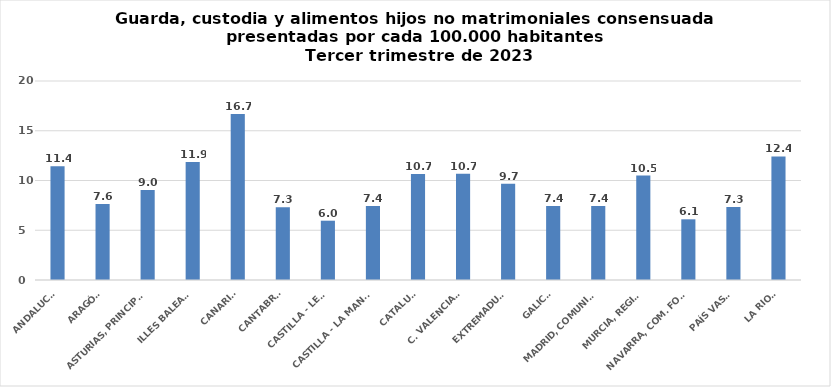
| Category | Series 0 |
|---|---|
| ANDALUCÍA | 11.435 |
| ARAGÓN | 7.633 |
| ASTURIAS, PRINCIPADO | 9.04 |
| ILLES BALEARS | 11.85 |
| CANARIAS | 16.675 |
| CANTABRIA | 7.306 |
| CASTILLA - LEÓN | 5.96 |
| CASTILLA - LA MANCHA | 7.45 |
| CATALUÑA | 10.66 |
| C. VALENCIANA | 10.674 |
| EXTREMADURA | 9.675 |
| GALICIA | 7.445 |
| MADRID, COMUNIDAD | 7.432 |
| MURCIA, REGIÓN | 10.498 |
| NAVARRA, COM. FORAL | 6.099 |
| PAÍS VASCO | 7.343 |
| LA RIOJA | 12.412 |